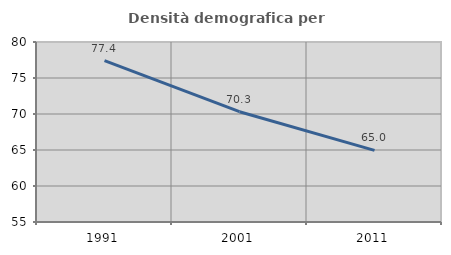
| Category | Densità demografica |
|---|---|
| 1991.0 | 77.406 |
| 2001.0 | 70.317 |
| 2011.0 | 64.952 |